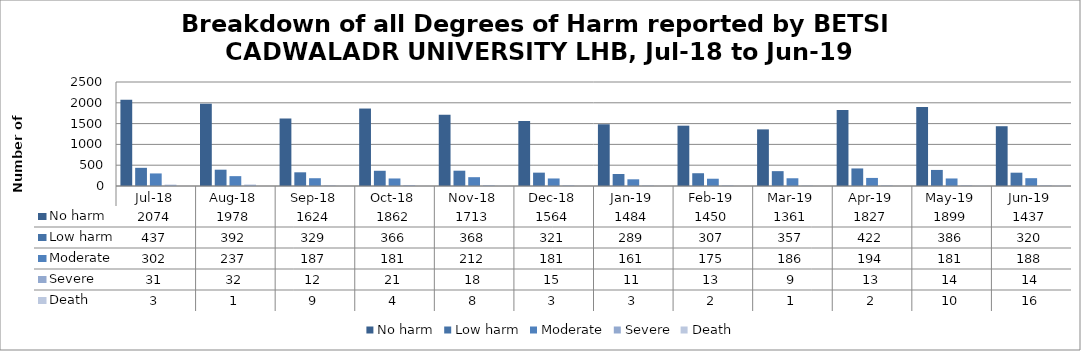
| Category | No harm | Low harm | Moderate | Severe | Death |
|---|---|---|---|---|---|
| Jul-18 | 2074 | 437 | 302 | 31 | 3 |
| Aug-18 | 1978 | 392 | 237 | 32 | 1 |
| Sep-18 | 1624 | 329 | 187 | 12 | 9 |
| Oct-18 | 1862 | 366 | 181 | 21 | 4 |
| Nov-18 | 1713 | 368 | 212 | 18 | 8 |
| Dec-18 | 1564 | 321 | 181 | 15 | 3 |
| Jan-19 | 1484 | 289 | 161 | 11 | 3 |
| Feb-19 | 1450 | 307 | 175 | 13 | 2 |
| Mar-19 | 1361 | 357 | 186 | 9 | 1 |
| Apr-19 | 1827 | 422 | 194 | 13 | 2 |
| May-19 | 1899 | 386 | 181 | 14 | 10 |
| Jun-19 | 1437 | 320 | 188 | 14 | 16 |